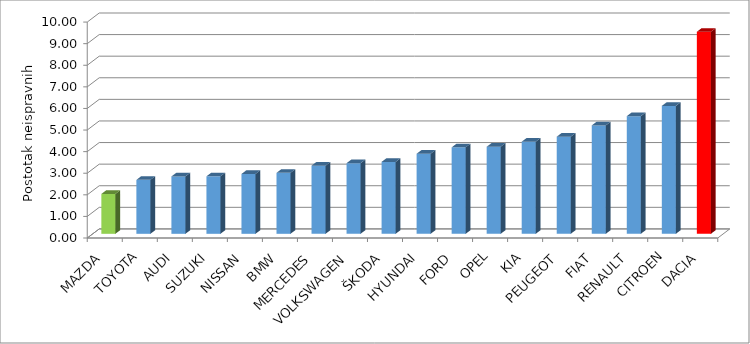
| Category | Series 4 |
|---|---|
| MAZDA | 1.845 |
| TOYOTA | 2.5 |
| AUDI | 2.655 |
| SUZUKI | 2.663 |
| NISSAN | 2.772 |
| BMW | 2.823 |
| MERCEDES | 3.157 |
| VOLKSWAGEN | 3.271 |
| ŠKODA | 3.33 |
| HYUNDAI | 3.708 |
| FORD | 4.003 |
| OPEL | 4.032 |
| KIA | 4.266 |
| PEUGEOT | 4.498 |
| FIAT | 5.022 |
| RENAULT | 5.449 |
| CITROEN | 5.923 |
| DACIA | 9.357 |